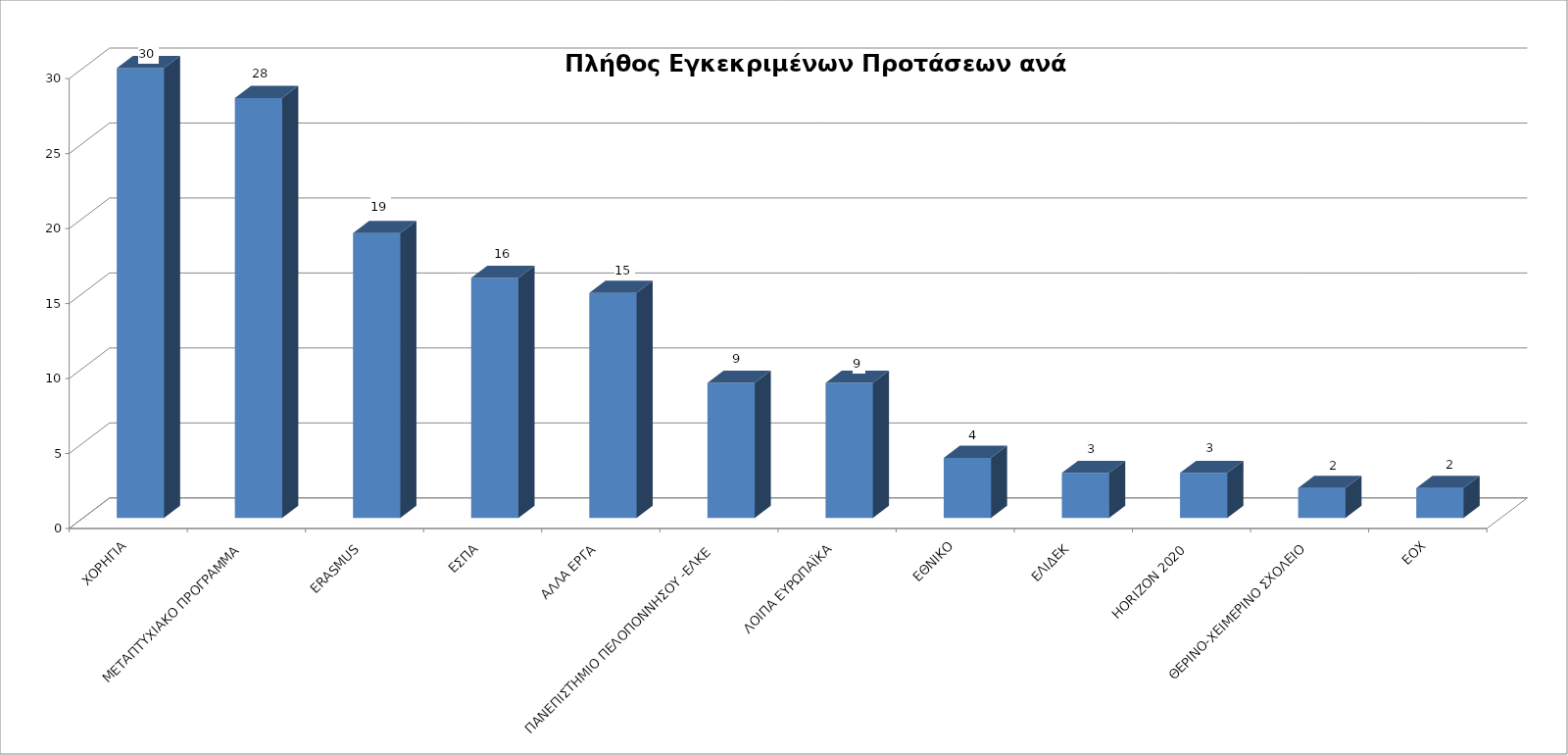
| Category | Series 0 |
|---|---|
| ΧΟΡΗΓΙΑ | 30 |
| ΜΕΤΑΠΤΥΧΙΑΚΟ ΠΡΟΓΡΑΜΜΑ | 28 |
| ERASMUS | 19 |
| ΕΣΠΑ | 16 |
| ΑΛΛΑ ΕΡΓΑ | 15 |
| ΠΑΝΕΠΙΣΤΗΜΙΟ ΠΕΛΟΠΟΝΝΗΣΟΥ -ΕΛΚΕ  | 9 |
| ΛΟΙΠΑ ΕΥΡΩΠΑΪΚΑ | 9 |
| ΕΘΝΙΚΟ | 4 |
| ΕΛΙΔΕΚ | 3 |
| HORIZON 2020 | 3 |
| ΘΕΡΙΝΟ-ΧΕΙΜΕΡΙΝΟ ΣΧΟΛΕΙΟ | 2 |
| ΕΟΧ | 2 |